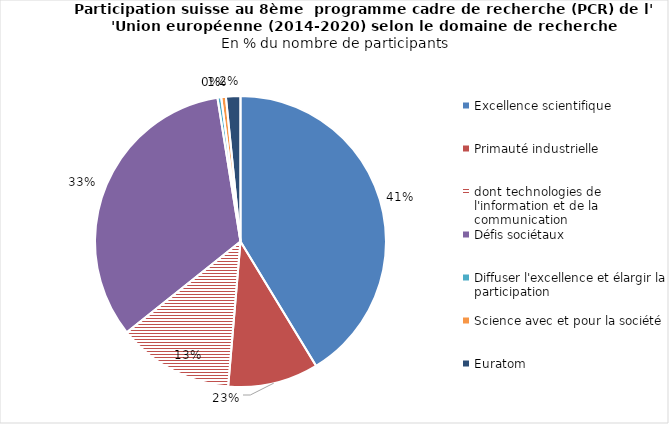
| Category | Series 0 |
|---|---|
| Excellence scientifique | 41.143 |
| Primauté industrielle | 10 |
| dont technologies de l'information et de la communication | 12.873 |
| Défis sociétaux | 33.059 |
| Diffuser l'excellence et élargir la participation | 0.412 |
| Science avec et pour la société | 0.515 |
| Euratom | 1.596 |